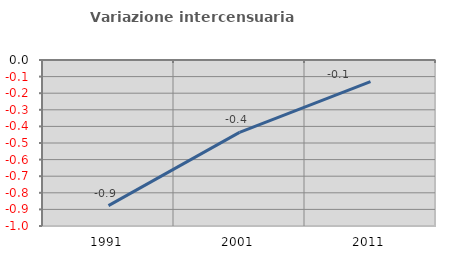
| Category | Variazione intercensuaria annua |
|---|---|
| 1991.0 | -0.877 |
| 2001.0 | -0.436 |
| 2011.0 | -0.13 |